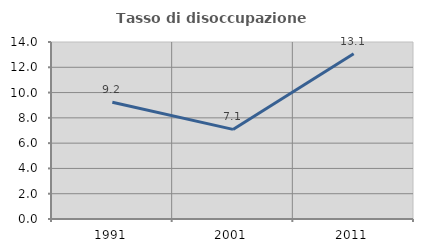
| Category | Tasso di disoccupazione giovanile  |
|---|---|
| 1991.0 | 9.231 |
| 2001.0 | 7.087 |
| 2011.0 | 13.077 |